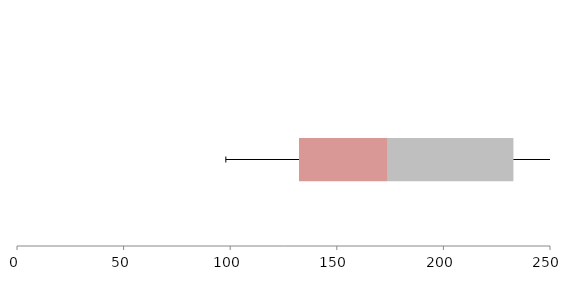
| Category | Series 1 | Series 2 | Series 3 |
|---|---|---|---|
| 0 | 132.272 | 41.63 | 58.937 |